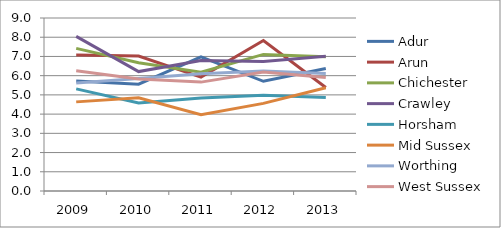
| Category | Adur | Arun | Chichester | Crawley | Horsham | Mid Sussex | Worthing | West Sussex |
|---|---|---|---|---|---|---|---|---|
| 2009.0 | 5.723 | 7.069 | 7.421 | 8.043 | 5.314 | 4.637 | 5.619 | 6.25 |
| 2010.0 | 5.56 | 7.022 | 6.676 | 6.212 | 4.577 | 4.851 | 5.857 | 5.83 |
| 2011.0 | 6.978 | 5.927 | 6.184 | 6.791 | 4.843 | 3.973 | 6.095 | 5.664 |
| 2012.0 | 5.706 | 7.83 | 7.106 | 6.735 | 4.979 | 4.558 | 6.248 | 6.186 |
| 2013.0 | 6.375 | 5.387 | 6.983 | 7.015 | 4.858 | 5.371 | 6.114 | 5.908 |